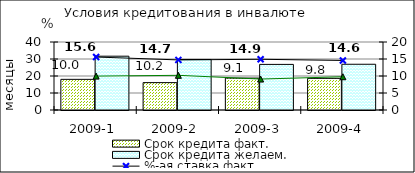
| Category | Срок кредита факт.  | Срок кредита желаем. |
|---|---|---|
| 2009-1 | 18.03 | 31.65 |
| 2009-2 | 16.11 | 29.71 |
| 2009-3 | 18.77 | 26.82 |
| 2009-4 | 18.61 | 26.91 |